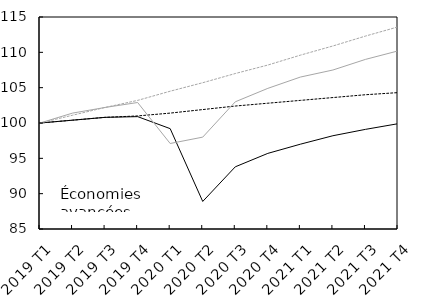
| Category | Économies avancées, prévisions d'avril 2020 | Économies avancées, prévisions de janvier 2020 | Économies émergentes et en développement, prévisions d'avril 2020 | Économies émergentes et en développement, prévisions de janvier 2020 |
|---|---|---|---|---|
| 2019 T1 | 100 | 100 | 100 | 100 |
| 2019 T2 | 100.4 | 100.4 | 101.4 | 101.1 |
| 2019 T3 | 100.8 | 100.8 | 102.2 | 102.2 |
| 2019 T4 | 100.9 | 101 | 102.9 | 103.2 |
| 2020 T1 | 99.2 | 101.4 | 97.1 | 104.5 |
| 2020 T2 | 88.9 | 101.9 | 98 | 105.7 |
| 2020 T3 | 93.8 | 102.4 | 103 | 107 |
| 2020 T4 | 95.7 | 102.8 | 104.9 | 108.2 |
| 2021 T1 | 97 | 103.2 | 106.5 | 109.6 |
| 2021 T2 | 98.2 | 103.6 | 107.5 | 110.9 |
| 2021 T3 | 99.1 | 104 | 109 | 112.3 |
| 2021 T4 | 99.9 | 104.3 | 110.2 | 113.6 |